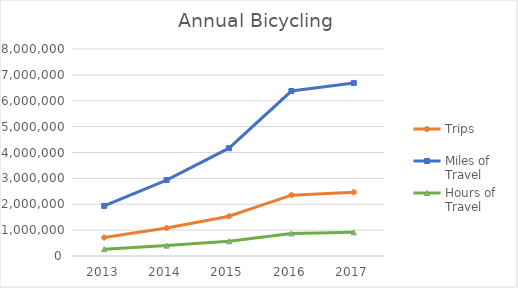
| Category | Trips | Miles of Travel | Hours of Travel |
|---|---|---|---|
| 2013 | 713664.531 | 1934387.712 | 264878.137 |
| 2014 | 1083156.888 | 2935896.744 | 402016.026 |
| 2015 | 1537227.401 | 4166654.869 | 570545.28 |
| 2016 | 2351952.632 | 6374967.608 | 872932.315 |
| 2017 | 2465253.872 | 6682070.62 | 914984.316 |